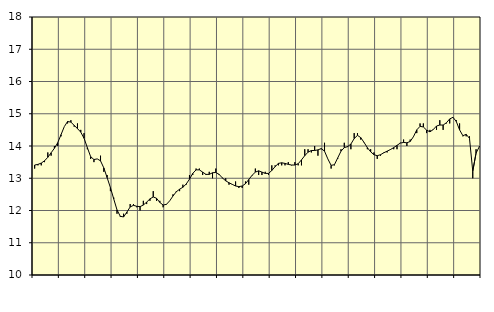
| Category | Piggar | Handel, SNI 45-47 |
|---|---|---|
| nan | 13.3 | 13.41 |
| 87.0 | 13.4 | 13.43 |
| 87.0 | 13.4 | 13.47 |
| 87.0 | 13.5 | 13.54 |
| nan | 13.8 | 13.65 |
| 88.0 | 13.7 | 13.79 |
| 88.0 | 14 | 13.93 |
| 88.0 | 14 | 14.1 |
| nan | 14.3 | 14.35 |
| 89.0 | 14.6 | 14.6 |
| 89.0 | 14.7 | 14.76 |
| 89.0 | 14.8 | 14.74 |
| nan | 14.6 | 14.64 |
| 90.0 | 14.7 | 14.54 |
| 90.0 | 14.5 | 14.43 |
| 90.0 | 14.4 | 14.24 |
| nan | 13.9 | 13.95 |
| 91.0 | 13.6 | 13.67 |
| 91.0 | 13.5 | 13.58 |
| 91.0 | 13.6 | 13.6 |
| nan | 13.7 | 13.54 |
| 92.0 | 13.2 | 13.32 |
| 92.0 | 13.1 | 13.02 |
| 92.0 | 12.6 | 12.71 |
| nan | 12.4 | 12.36 |
| 93.0 | 11.9 | 12.02 |
| 93.0 | 11.8 | 11.82 |
| 93.0 | 11.9 | 11.8 |
| nan | 11.9 | 11.95 |
| 94.0 | 12.2 | 12.11 |
| 94.0 | 12.2 | 12.16 |
| 94.0 | 12.1 | 12.13 |
| nan | 12 | 12.12 |
| 95.0 | 12.3 | 12.17 |
| 95.0 | 12.2 | 12.26 |
| 95.0 | 12.3 | 12.36 |
| nan | 12.6 | 12.42 |
| 96.0 | 12.3 | 12.38 |
| 96.0 | 12.3 | 12.25 |
| 96.0 | 12.1 | 12.17 |
| nan | 12.2 | 12.19 |
| 97.0 | 12.3 | 12.3 |
| 97.0 | 12.5 | 12.45 |
| 97.0 | 12.6 | 12.58 |
| nan | 12.6 | 12.66 |
| 98.0 | 12.8 | 12.72 |
| 98.0 | 12.8 | 12.82 |
| 98.0 | 13.1 | 12.97 |
| nan | 13.1 | 13.15 |
| 99.0 | 13.3 | 13.26 |
| 99.0 | 13.3 | 13.26 |
| 99.0 | 13.1 | 13.19 |
| nan | 13.1 | 13.12 |
| 0.0 | 13.2 | 13.12 |
| 0.0 | 13 | 13.17 |
| 0.0 | 13.3 | 13.18 |
| nan | 13.1 | 13.12 |
| 1.0 | 13 | 13.01 |
| 1.0 | 13 | 12.92 |
| 1.0 | 12.8 | 12.86 |
| nan | 12.8 | 12.81 |
| 2.0 | 12.9 | 12.76 |
| 2.0 | 12.7 | 12.74 |
| 2.0 | 12.7 | 12.76 |
| nan | 12.9 | 12.83 |
| 3.0 | 12.8 | 12.96 |
| 3.0 | 13.1 | 13.09 |
| 3.0 | 13.3 | 13.19 |
| nan | 13.1 | 13.23 |
| 4.0 | 13.1 | 13.19 |
| 4.0 | 13.2 | 13.15 |
| 4.0 | 13.1 | 13.15 |
| nan | 13.4 | 13.24 |
| 5.0 | 13.4 | 13.36 |
| 5.0 | 13.4 | 13.46 |
| 5.0 | 13.4 | 13.48 |
| nan | 13.4 | 13.46 |
| 6.0 | 13.5 | 13.43 |
| 6.0 | 13.4 | 13.41 |
| 6.0 | 13.5 | 13.41 |
| nan | 13.4 | 13.45 |
| 7.0 | 13.4 | 13.57 |
| 7.0 | 13.9 | 13.7 |
| 7.0 | 13.9 | 13.81 |
| nan | 13.8 | 13.86 |
| 8.0 | 14 | 13.86 |
| 8.0 | 13.7 | 13.88 |
| 8.0 | 13.9 | 13.92 |
| nan | 14.1 | 13.84 |
| 9.0 | 13.6 | 13.6 |
| 9.0 | 13.3 | 13.4 |
| 9.0 | 13.4 | 13.42 |
| nan | 13.6 | 13.63 |
| 10.0 | 13.9 | 13.84 |
| 10.0 | 14.1 | 13.95 |
| 10.0 | 14 | 13.98 |
| nan | 13.9 | 14.06 |
| 11.0 | 14.4 | 14.23 |
| 11.0 | 14.4 | 14.33 |
| 11.0 | 14.2 | 14.26 |
| nan | 14.1 | 14.11 |
| 12.0 | 13.9 | 13.95 |
| 12.0 | 13.9 | 13.82 |
| 12.0 | 13.8 | 13.73 |
| nan | 13.6 | 13.7 |
| 13.0 | 13.7 | 13.73 |
| 13.0 | 13.8 | 13.79 |
| 13.0 | 13.8 | 13.84 |
| nan | 13.9 | 13.89 |
| 14.0 | 13.9 | 13.95 |
| 14.0 | 13.9 | 14.02 |
| 14.0 | 14.1 | 14.09 |
| nan | 14.2 | 14.11 |
| 15.0 | 14 | 14.1 |
| 15.0 | 14.2 | 14.14 |
| 15.0 | 14.3 | 14.29 |
| nan | 14.4 | 14.5 |
| 16.0 | 14.7 | 14.61 |
| 16.0 | 14.7 | 14.59 |
| 16.0 | 14.4 | 14.49 |
| nan | 14.5 | 14.44 |
| 17.0 | 14.5 | 14.51 |
| 17.0 | 14.5 | 14.62 |
| 17.0 | 14.8 | 14.65 |
| nan | 14.5 | 14.65 |
| 18.0 | 14.7 | 14.72 |
| 18.0 | 14.7 | 14.84 |
| 18.0 | 14.9 | 14.89 |
| nan | 14.8 | 14.76 |
| 19.0 | 14.7 | 14.5 |
| 19.0 | 14.3 | 14.32 |
| 19.0 | 14.3 | 14.36 |
| nan | 14.3 | 14.24 |
| 20.0 | 13 | 13.22 |
| 20.0 | 13.9 | 13.78 |
| 20.0 | 14 | 13.98 |